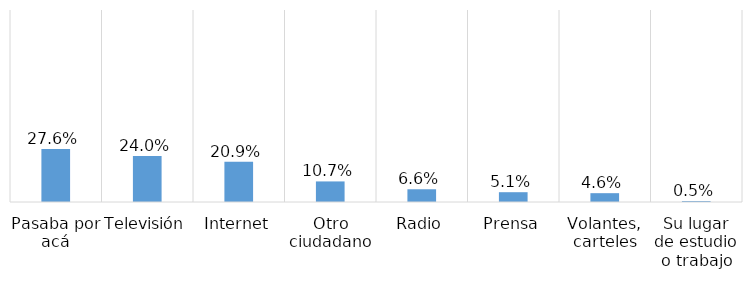
| Category | Series 0 |
|---|---|
| Pasaba por acá | 0.276 |
| Televisión | 0.24 |
| Internet | 0.209 |
| Otro ciudadano | 0.107 |
| Radio | 0.066 |
| Prensa | 0.051 |
| Volantes, carteles | 0.046 |
| Su lugar de estudio o trabajo | 0.005 |